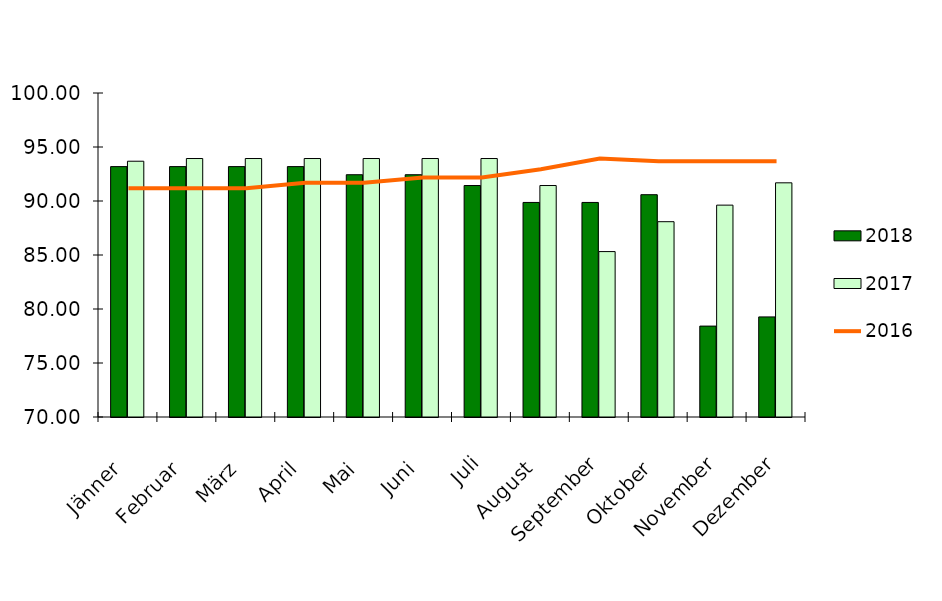
| Category | 2018 | 2017 |
|---|---|---|
| Jänner | 93.183 | 93.683 |
| Februar | 93.183 | 93.933 |
| März | 93.183 | 93.933 |
| April | 93.183 | 93.933 |
| Mai | 92.433 | 93.933 |
| Juni | 92.433 | 93.933 |
| Juli | 91.433 | 93.933 |
| August | 89.867 | 91.433 |
| September | 89.867 | 85.317 |
| Oktober | 90.583 | 88.083 |
| November | 78.417 | 89.617 |
| Dezember | 79.267 | 91.683 |